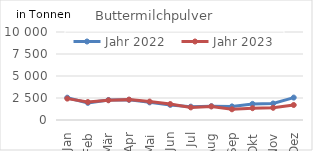
| Category | Jahr 2022 | Jahr 2023 |
|---|---|---|
| Jan | 2535.806 | 2430.7 |
| Feb | 1948.632 | 2042.596 |
| Mär | 2275.201 | 2239.993 |
| Apr | 2293.596 | 2315.084 |
| Mai | 2002.087 | 2093.542 |
| Jun | 1716.76 | 1812.314 |
| Jul | 1517.628 | 1433.381 |
| Aug | 1566.254 | 1544.936 |
| Sep | 1546.275 | 1216.686 |
| Okt | 1830.785 | 1341.051 |
| Nov | 1874.856 | 1386.41 |
| Dez | 2547.661 | 1705.233 |